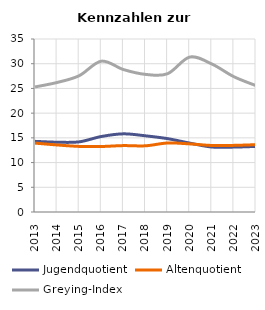
| Category | Jugendquotient | Altenquotient | Greying-Index |
|---|---|---|---|
| 2013.0 | 14.292 | 13.939 | 25.301 |
| 2014.0 | 14.12 | 13.562 | 26.205 |
| 2015.0 | 14.19 | 13.269 | 27.576 |
| 2016.0 | 15.273 | 13.253 | 30.514 |
| 2017.0 | 15.813 | 13.433 | 28.824 |
| 2018.0 | 15.412 | 13.391 | 27.841 |
| 2019.0 | 14.838 | 13.961 | 27.978 |
| 2020.0 | 13.94 | 13.78 | 31.34 |
| 2021.0 | 13.146 | 13.459 | 29.945 |
| 2022.0 | 13.13 | 13.48 | 27.37 |
| 2023.0 | 13.272 | 13.619 | 25.564 |